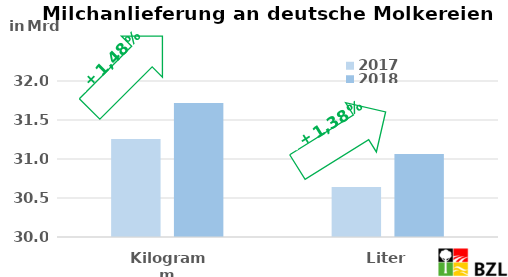
| Category | 2017 | 2018 |
|---|---|---|
| Kilogramm | 31.255 | 31.716 |
| Liter | 30.641 | 31.063 |